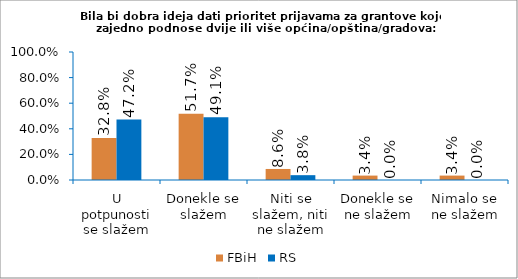
| Category | FBiH | RS |
|---|---|---|
| U potpunosti se slažem | 0.328 | 0.472 |
| Donekle se slažem | 0.517 | 0.491 |
| Niti se slažem, niti ne slažem | 0.086 | 0.038 |
| Donekle se ne slažem | 0.034 | 0 |
| Nimalo se ne slažem | 0.034 | 0 |